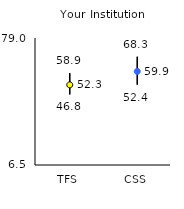
| Category | 25th | 75th | Mean |
|---|---|---|---|
| TFS | 46.8 | 58.9 | 52.25 |
| CSS | 52.4 | 68.3 | 59.94 |